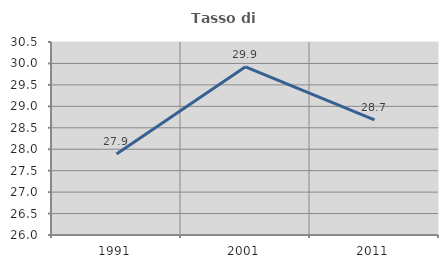
| Category | Tasso di occupazione   |
|---|---|
| 1991.0 | 27.889 |
| 2001.0 | 29.92 |
| 2011.0 | 28.683 |